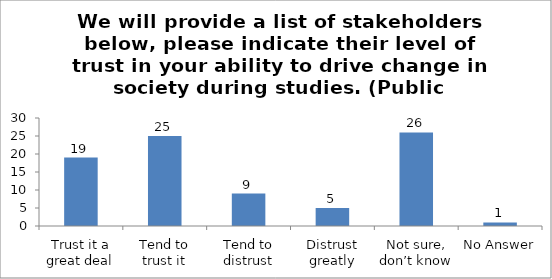
| Category | We will provide a list of stakeholders below, please indicate their level of trust in your ability to drive change in society during studies. (Public Institutions ) |
|---|---|
| Trust it a great deal | 19 |
| Tend to trust it | 25 |
| Tend to distrust | 9 |
| Distrust greatly | 5 |
| Not sure, don’t know | 26 |
| No Answer | 1 |